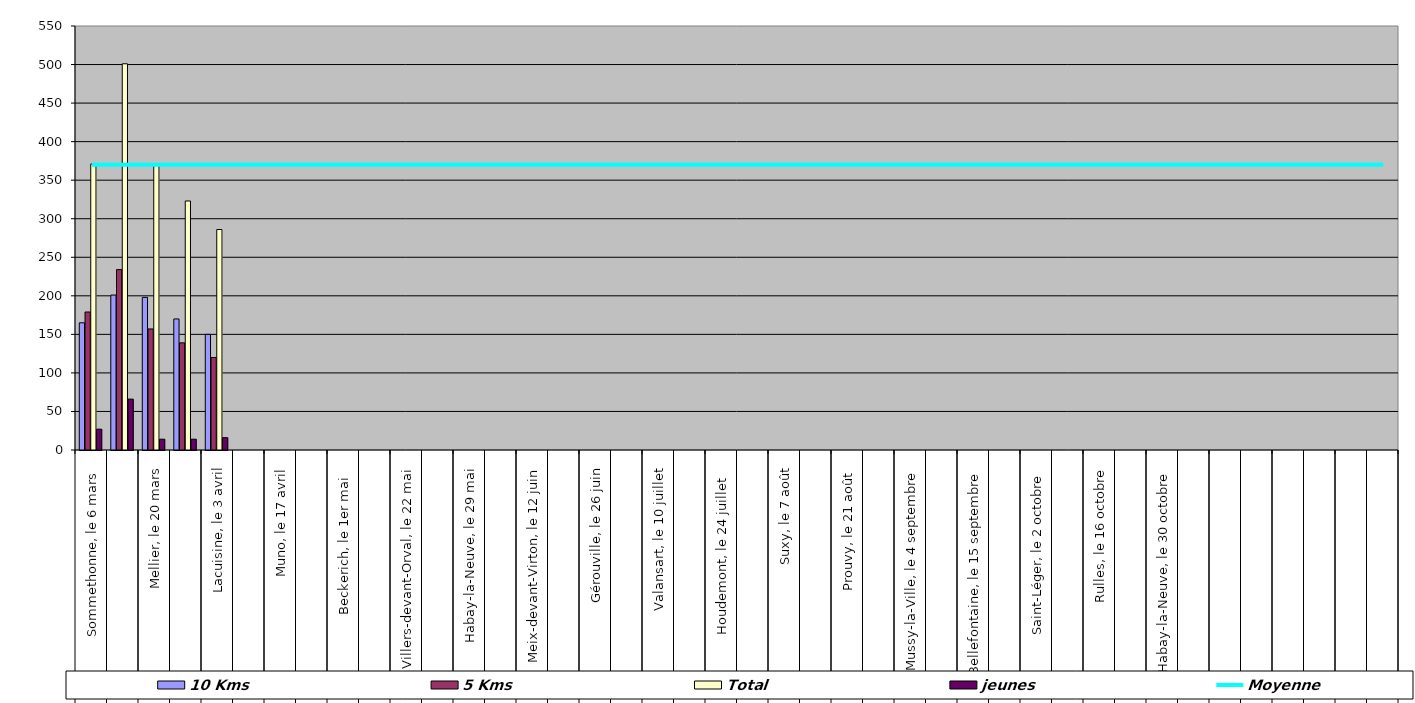
| Category | 10 Kms | 5 Kms | Total | jeunes |
|---|---|---|---|---|
| 0 | 165 | 179 | 371 | 27 |
| 1 | 201 | 234 | 501 | 66 |
| 2 | 198 | 157 | 369 | 14 |
| 3 | 170 | 139 | 323 | 14 |
| 4 | 150 | 120 | 286 | 16 |
| 5 | 0 | 0 | 0 | 0 |
| 6 | 0 | 0 | 0 | 0 |
| 7 | 0 | 0 | 0 | 0 |
| 8 | 0 | 0 | 0 | 0 |
| 9 | 0 | 0 | 0 | 0 |
| 10 | 0 | 0 | 0 | 0 |
| 11 | 0 | 0 | 0 | 0 |
| 12 | 0 | 0 | 0 | 0 |
| 13 | 0 | 0 | 0 | 0 |
| 14 | 0 | 0 | 0 | 0 |
| 15 | 0 | 0 | 0 | 0 |
| 16 | 0 | 0 | 0 | 0 |
| 17 | 0 | 0 | 0 | 0 |
| 18 | 0 | 0 | 0 | 0 |
| 19 | 0 | 0 | 0 | 0 |
| 20 | 0 | 0 | 0 | 0 |
| 21 | 0 | 0 | 0 | 0 |
| 22 | 0 | 0 | 0 | 0 |
| 23 | 0 | 0 | 0 | 0 |
| 24 | 0 | 0 | 0 | 0 |
| 25 | 0 | 0 | 0 | 0 |
| 26 | 0 | 0 | 0 | 0 |
| 27 | 0 | 0 | 0 | 0 |
| 28 | 0 | 0 | 0 | 0 |
| 29 | 0 | 0 | 0 | 0 |
| 30 | 0 | 0 | 0 | 0 |
| 31 | 0 | 0 | 0 | 0 |
| 32 | 0 | 0 | 0 | 0 |
| 33 | 0 | 0 | 0 | 0 |
| 34 | 0 | 0 | 0 | 0 |
| 35 | 0 | 0 | 0 | 0 |
| 36 | 0 | 0 | 0 | 0 |
| 37 | 0 | 0 | 0 | 0 |
| 38 | 0 | 0 | 0 | 0 |
| 39 | 0 | 0 | 0 | 0 |
| 40 | 0 | 0 | 0 | 0 |
| 41 | 0 | 0 | 0 | 0 |